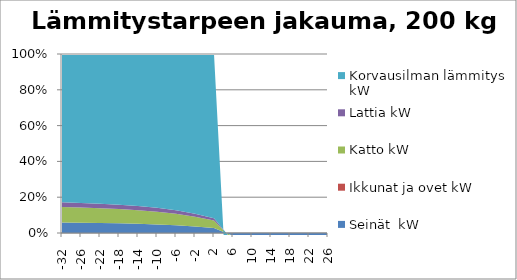
| Category | Seinät  kW | Ikkunat ja ovet kW | Katto kW | Lattia kW | Korvausilman lämmitys kW |
|---|---|---|---|---|---|
| -32.0 | 7.392 | 0 | 10.92 | 3.276 | 104.564 |
| -26.0 | 6.125 | 0 | 9.048 | 2.714 | 89.055 |
| -22.0 | 5.28 | 0 | 7.8 | 2.34 | 78.973 |
| -18.0 | 4.435 | 0 | 6.552 | 1.966 | 69.048 |
| -14.0 | 3.59 | 0 | 5.304 | 1.591 | 59.169 |
| -10.0 | 2.746 | 0 | 4.056 | 1.217 | 49.095 |
| -6.0 | 1.901 | 0 | 2.808 | 0.842 | 38.306 |
| -2.0 | 1.056 | 0 | 1.56 | 0.468 | 25.535 |
| 2.0 | 0.211 | 0 | 0.312 | 0.094 | 6.899 |
| 6.0 | -0.634 | 0 | -0.936 | -0.281 | -37.756 |
| 10.0 | -1.478 | 0 | -2.184 | -0.655 | -14.435 |
| 14.0 | -2.323 | 0 | -3.432 | -1.03 | -22.684 |
| 18.0 | -3.168 | 0 | -4.68 | -1.404 | -30.932 |
| 22.0 | -4.013 | 0 | -5.928 | -1.778 | -39.181 |
| 26.0 | -4.858 | 0 | -7.176 | -2.153 | -47.429 |